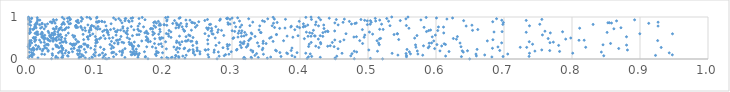
| Category | Series 0 |
|---|---|
| 0.6494886610343494 | 0.001 |
| 0.521462344505284 | 0.002 |
| 0.11608849450142009 | 0.003 |
| 0.27804752494028784 | 0.004 |
| 0.17644899707597306 | 0.005 |
| 0.47984781632911 | 0.006 |
| 0.4521540243167086 | 0.007 |
| 0.03461580034584222 | 0.008 |
| 0.3194482171691986 | 0.009 |
| 0.1137184963279405 | 0.01 |
| 0.09030818656221766 | 0.011 |
| 0.3169902203502368 | 0.012 |
| 0.4105012767373106 | 0.013 |
| 0.5036008177045362 | 0.014 |
| 0.31768928369719773 | 0.015 |
| 0.20602338840897308 | 0.016 |
| 0.11905451637764762 | 0.017 |
| 0.21639314690966088 | 0.018 |
| 0.3519166139028651 | 0.019 |
| 0.2308382323468313 | 0.02 |
| 0.45136389129884225 | 0.021 |
| 0.07502207136637869 | 0.022 |
| 0.3288669173679931 | 0.023 |
| 0.0843500697387894 | 0.024 |
| 0.11015393308047583 | 0.025 |
| 0.04388557988866332 | 0.026 |
| 0.014700348563221563 | 0.027 |
| 0.04069689261007055 | 0.028 |
| 0.09464828511411026 | 0.029 |
| 0.22182591513502103 | 0.03 |
| 0.19652974818995164 | 0.031 |
| 0.21071684444435138 | 0.032 |
| 0.05077171188107131 | 0.033 |
| 0.20404492660771553 | 0.034 |
| 0.0005223421724815143 | 0.035 |
| 0.142522578799775 | 0.036 |
| 0.33869406549150366 | 0.037 |
| 0.04964213489435691 | 0.038 |
| 0.31781598535940425 | 0.039 |
| 0.4298402847156558 | 0.04 |
| 0.16169248378899043 | 0.041 |
| 0.32810404902974544 | 0.042 |
| 0.21201989886324857 | 0.043 |
| 0.17243190627608285 | 0.044 |
| 0.2658015538731133 | 0.045 |
| 0.3568952925012712 | 0.046 |
| 0.3925011398297004 | 0.047 |
| 0.6821632982798048 | 0.048 |
| 0.09393251363926552 | 0.049 |
| 0.006020017742359295 | 0.05 |
| 0.4124164132873489 | 0.051 |
| 0.5565886241710607 | 0.052 |
| 0.1258697415392412 | 0.053 |
| 0.07612051388423166 | 0.054 |
| 0.07802081785905142 | 0.055 |
| 0.637436331963943 | 0.056 |
| 0.2216136582268961 | 0.057 |
| 0.17271470979084824 | 0.058 |
| 0.6985950466421643 | 0.059 |
| 0.3720980365507339 | 0.06 |
| 0.41718409904077886 | 0.061 |
| 0.73689545383707 | 0.062 |
| 0.041215482585070955 | 0.063 |
| 0.0021339338914680233 | 0.064 |
| 0.001865133544264478 | 0.065 |
| 0.4540390412171769 | 0.066 |
| 0.2811025030872496 | 0.067 |
| 0.05902101752125556 | 0.068 |
| 0.22767857338317726 | 0.069 |
| 0.6141444347383196 | 0.07 |
| 0.11156402404066898 | 0.071 |
| 0.08142129465043654 | 0.072 |
| 0.6593704401362447 | 0.073 |
| 0.09845212794665376 | 0.074 |
| 0.4747217766902059 | 0.075 |
| 0.21777567578590593 | 0.076 |
| 0.8467275410686786 | 0.077 |
| 0.058152115973771734 | 0.078 |
| 0.2885686934869976 | 0.079 |
| 0.388207333501798 | 0.08 |
| 0.18862834548246737 | 0.081 |
| 0.051446982025896 | 0.082 |
| 0.5565832977398479 | 0.083 |
| 0.21704594439855854 | 0.084 |
| 0.33367474930615787 | 0.085 |
| 0.9228195097448253 | 0.086 |
| 0.005740742731084875 | 0.087 |
| 0.10421251709805304 | 0.088 |
| 0.0361262454268739 | 0.089 |
| 0.2326286531945125 | 0.09 |
| 0.5804903267637865 | 0.091 |
| 0.16236943740363696 | 0.092 |
| 0.54401472925715 | 0.093 |
| 0.13798940811428392 | 0.094 |
| 0.004973049851910261 | 0.095 |
| 0.6716411342164854 | 0.096 |
| 0.0736699987943389 | 0.097 |
| 0.24539126062458969 | 0.098 |
| 0.9475536294726269 | 0.099 |
| 0.15197070107703603 | 0.1 |
| 0.10573655711410555 | 0.101 |
| 0.15704520524644855 | 0.102 |
| 0.2646988259223237 | 0.103 |
| 0.07923338026380734 | 0.104 |
| 0.29053812784480787 | 0.105 |
| 0.11395893438304763 | 0.106 |
| 0.008564612743335953 | 0.107 |
| 0.09669048238276043 | 0.108 |
| 0.024406453539530543 | 0.109 |
| 0.12971798132584947 | 0.11 |
| 0.1536043669407493 | 0.111 |
| 0.1874353585462693 | 0.112 |
| 0.34618051726109167 | 0.113 |
| 0.29554801496956556 | 0.114 |
| 0.15703902994418031 | 0.115 |
| 0.020249727889272144 | 0.116 |
| 0.6587956815969583 | 0.117 |
| 0.705515074166796 | 0.118 |
| 0.5733851764432616 | 0.119 |
| 0.2528935011124422 | 0.12 |
| 0.4150698207193128 | 0.121 |
| 0.5624674569833095 | 0.122 |
| 0.07290264576220701 | 0.123 |
| 0.1600500241689326 | 0.124 |
| 0.15630985537072578 | 0.125 |
| 0.03563804777516389 | 0.126 |
| 0.4764823204436721 | 0.127 |
| 0.38172839247803575 | 0.128 |
| 0.3361831290863529 | 0.129 |
| 0.5559493702366946 | 0.13 |
| 0.07603327418525646 | 0.131 |
| 0.1637134296481883 | 0.132 |
| 0.007424931813448635 | 0.133 |
| 0.05030379841607353 | 0.134 |
| 0.535479275379183 | 0.135 |
| 0.46181572507755253 | 0.136 |
| 0.7374749645225641 | 0.137 |
| 0.40847802505395 | 0.138 |
| 0.8010495657398039 | 0.139 |
| 0.18913269820395467 | 0.14 |
| 0.054594178377062666 | 0.141 |
| 0.10957943193494203 | 0.142 |
| 0.2430766108713254 | 0.143 |
| 0.38042543852181715 | 0.144 |
| 0.12321515116095474 | 0.145 |
| 0.9430002613933721 | 0.146 |
| 0.1388857724103417 | 0.147 |
| 0.19792205568538027 | 0.148 |
| 0.044782040619314865 | 0.149 |
| 0.05998934123280795 | 0.15 |
| 0.39566554308588525 | 0.151 |
| 0.15419022321396747 | 0.152 |
| 0.3704136347443543 | 0.153 |
| 0.005278708271918827 | 0.154 |
| 0.1917369538777228 | 0.155 |
| 0.05977559885887576 | 0.156 |
| 0.12615730703051228 | 0.157 |
| 0.09916216589450556 | 0.158 |
| 0.12418934390480439 | 0.159 |
| 0.27354000552512364 | 0.16 |
| 0.08502543478047973 | 0.161 |
| 0.0019670118983497746 | 0.162 |
| 0.22046212903786325 | 0.163 |
| 0.6401367441600829 | 0.164 |
| 0.8431647136437311 | 0.165 |
| 0.2799066810420926 | 0.166 |
| 0.3304912044788769 | 0.167 |
| 0.4833456466239459 | 0.168 |
| 0.1592070846086886 | 0.169 |
| 0.15091946754637192 | 0.17 |
| 0.5608354572556035 | 0.171 |
| 0.2989105453598567 | 0.172 |
| 0.17126424721291278 | 0.173 |
| 0.06549217583132368 | 0.174 |
| 0.25274631760380534 | 0.175 |
| 0.1385313388377381 | 0.176 |
| 0.6191432865971171 | 0.177 |
| 0.24362272000989474 | 0.178 |
| 0.04922484640027347 | 0.179 |
| 0.781737293305003 | 0.18 |
| 0.13493337500051142 | 0.181 |
| 0.047327222321522415 | 0.182 |
| 0.18910979585686197 | 0.183 |
| 0.02954960418930423 | 0.184 |
| 0.4798049193426273 | 0.185 |
| 0.5139706774507805 | 0.186 |
| 0.15607620834521158 | 0.187 |
| 0.7454567832819398 | 0.188 |
| 0.23563096626020155 | 0.189 |
| 0.5725461231175325 | 0.19 |
| 0.33055484147526115 | 0.191 |
| 0.36532684050721176 | 0.192 |
| 0.6058299698277697 | 0.193 |
| 0.638550155755553 | 0.194 |
| 0.02117534596698284 | 0.195 |
| 0.6463108829816143 | 0.196 |
| 0.0760752698321636 | 0.197 |
| 0.24874700414598408 | 0.198 |
| 0.05581551262226918 | 0.199 |
| 0.7672476705895918 | 0.2 |
| 0.07483048492096744 | 0.201 |
| 0.38700685743427393 | 0.202 |
| 0.6937457256038927 | 0.203 |
| 0.008035219251176342 | 0.204 |
| 0.0726992611738711 | 0.205 |
| 0.13921329002970653 | 0.206 |
| 0.02975977845998959 | 0.207 |
| 0.36404204219202296 | 0.208 |
| 0.26127597969385047 | 0.209 |
| 0.2489947636013488 | 0.21 |
| 0.32779740464520957 | 0.211 |
| 0.3066767545021251 | 0.212 |
| 0.2739226330594687 | 0.213 |
| 0.881525566059282 | 0.214 |
| 0.501222706563029 | 0.215 |
| 0.755530889673655 | 0.216 |
| 0.23751999655398304 | 0.217 |
| 0.050963534229020994 | 0.218 |
| 0.2604629456344577 | 0.219 |
| 0.008934631141835878 | 0.22 |
| 0.34463719875459226 | 0.221 |
| 0.004728723983251518 | 0.222 |
| 0.24261849562746973 | 0.223 |
| 0.09795522903747834 | 0.224 |
| 0.2178038575976246 | 0.225 |
| 0.26514458880435704 | 0.226 |
| 0.11153591177601119 | 0.227 |
| 0.5574045810858721 | 0.228 |
| 0.6604327016796618 | 0.229 |
| 0.3074035868647762 | 0.23 |
| 0.08288533075371864 | 0.231 |
| 0.022279549344032156 | 0.232 |
| 0.11175561698419494 | 0.233 |
| 0.1592735384224998 | 0.234 |
| 0.012981144247003688 | 0.235 |
| 0.1541379076687254 | 0.236 |
| 0.013200576453335059 | 0.237 |
| 0.03656805825016583 | 0.238 |
| 0.01793436677466723 | 0.239 |
| 0.06374319914384922 | 0.24 |
| 0.20347751622134286 | 0.241 |
| 0.2938699572541828 | 0.242 |
| 0.2294391957187075 | 0.243 |
| 0.4559501641203152 | 0.244 |
| 0.008254871750606286 | 0.245 |
| 0.006894924634581304 | 0.246 |
| 0.14266558290235395 | 0.247 |
| 0.5980132676904659 | 0.248 |
| 0.12247667196111676 | 0.249 |
| 0.8686737282387381 | 0.25 |
| 0.22281853332474755 | 0.251 |
| 0.0018522200527067267 | 0.252 |
| 0.06773360197517886 | 0.253 |
| 0.05142435652042647 | 0.254 |
| 0.6830072973621627 | 0.255 |
| 0.027264473249232715 | 0.256 |
| 0.3454060857852406 | 0.257 |
| 0.0674399122419657 | 0.258 |
| 0.23045746947288262 | 0.259 |
| 0.09232629601727392 | 0.26 |
| 0.3881976361238699 | 0.261 |
| 0.18795579889412867 | 0.262 |
| 0.15429707119767622 | 0.263 |
| 0.024891370539324355 | 0.264 |
| 0.24860750994034 | 0.265 |
| 0.007706102520252281 | 0.266 |
| 0.588553949464931 | 0.267 |
| 0.04977120173314961 | 0.268 |
| 0.2867564846536537 | 0.269 |
| 0.21964435243893682 | 0.27 |
| 0.04558446060368635 | 0.271 |
| 0.31381060653932485 | 0.272 |
| 0.4276569933848232 | 0.273 |
| 0.12583065938106847 | 0.274 |
| 0.931143590801347 | 0.275 |
| 0.07516804513392124 | 0.276 |
| 0.7333863509922961 | 0.277 |
| 0.7239055027659428 | 0.278 |
| 0.8201483601524081 | 0.279 |
| 0.10657667361875209 | 0.28 |
| 0.5704048504690287 | 0.281 |
| 0.32114724388447663 | 0.282 |
| 0.04414717657974206 | 0.283 |
| 0.078123986174957 | 0.284 |
| 0.015416170376930676 | 0.285 |
| 0.21458079440814273 | 0.286 |
| 0.6911081969891233 | 0.287 |
| 0.08783749916853334 | 0.288 |
| 0.18290508595374982 | 0.289 |
| 0.17461138423944184 | 0.29 |
| 0.0758287986264313 | 0.291 |
| 0.6367719150189647 | 0.292 |
| 0.00022962512884371576 | 0.293 |
| 0.4501700503165307 | 0.294 |
| 0.041817485306633644 | 0.295 |
| 0.1972844925743655 | 0.296 |
| 0.41267798980432757 | 0.297 |
| 0.5900601236272432 | 0.298 |
| 0.15377568480159298 | 0.299 |
| 0.2933896586755658 | 0.3 |
| 0.07824466394101869 | 0.301 |
| 0.015266564743028984 | 0.302 |
| 0.15536386987250903 | 0.303 |
| 0.4407271840352406 | 0.304 |
| 0.33944198868645764 | 0.305 |
| 0.423183912952787 | 0.306 |
| 0.04924296071480655 | 0.307 |
| 0.1629263088403124 | 0.308 |
| 0.09904295267070028 | 0.309 |
| 0.6083288572359316 | 0.31 |
| 0.0490708695439377 | 0.311 |
| 0.024250365449459334 | 0.312 |
| 0.12329579377296748 | 0.313 |
| 0.5816009679701056 | 0.314 |
| 0.4444507613787219 | 0.315 |
| 0.32314318395277264 | 0.316 |
| 0.0027653251379720412 | 0.317 |
| 0.04290030884760656 | 0.318 |
| 0.1622755403828924 | 0.319 |
| 0.08671196388095076 | 0.32 |
| 0.08826259150858722 | 0.321 |
| 0.2424160925289884 | 0.322 |
| 0.06568844078373932 | 0.323 |
| 0.7803554341638497 | 0.324 |
| 0.276379290982732 | 0.325 |
| 0.3121349461843676 | 0.326 |
| 0.011405992095324531 | 0.327 |
| 0.15265230935159205 | 0.328 |
| 0.06860020142375563 | 0.329 |
| 0.1527038421428817 | 0.33 |
| 0.8802309453502217 | 0.331 |
| 0.0296806454817106 | 0.332 |
| 0.00252019334879272 | 0.333 |
| 0.040792106599989046 | 0.334 |
| 0.0010867512504336078 | 0.335 |
| 0.5699031407729226 | 0.336 |
| 0.2961684632853318 | 0.337 |
| 0.8456183021644349 | 0.338 |
| 0.06767956649653979 | 0.339 |
| 0.516630233343135 | 0.34 |
| 0.22376964466074825 | 0.341 |
| 0.0025024282833313416 | 0.342 |
| 0.6014033020299704 | 0.343 |
| 0.29303131613695543 | 0.344 |
| 0.12049570202351287 | 0.345 |
| 0.6139243353053871 | 0.346 |
| 0.026906678039696853 | 0.347 |
| 0.1494479431153668 | 0.348 |
| 0.19224761003320734 | 0.349 |
| 0.02920892223499318 | 0.35 |
| 0.06452551335190145 | 0.351 |
| 0.7420473268039514 | 0.352 |
| 0.08319541446260896 | 0.353 |
| 0.413570071380825 | 0.354 |
| 0.32350600040377664 | 0.355 |
| 0.08189947504324353 | 0.356 |
| 0.08397219774653672 | 0.357 |
| 0.13238698723763687 | 0.358 |
| 0.2645480376294325 | 0.359 |
| 0.06755703321511021 | 0.36 |
| 0.430556659908537 | 0.361 |
| 0.6120003238980708 | 0.362 |
| 0.19572370437407155 | 0.363 |
| 0.062294502039626845 | 0.364 |
| 0.07075939410547107 | 0.365 |
| 0.31716687519725956 | 0.366 |
| 0.18602265127874543 | 0.367 |
| 0.3501648076986368 | 0.368 |
| 0.492078854532376 | 0.369 |
| 0.8567314498293633 | 0.37 |
| 0.0018489994356193171 | 0.371 |
| 0.3456718393208354 | 0.372 |
| 0.3151054722855979 | 0.373 |
| 0.15187038226249638 | 0.374 |
| 0.24817733301616013 | 0.375 |
| 0.5899319164831457 | 0.376 |
| 0.1270681743313695 | 0.377 |
| 0.04711196553172926 | 0.378 |
| 0.5156072618495326 | 0.379 |
| 0.6353604654067103 | 0.38 |
| 0.0996691305462469 | 0.381 |
| 0.5934785100103356 | 0.382 |
| 0.005389339360726266 | 0.383 |
| 0.696546189564966 | 0.384 |
| 0.3374714256783928 | 0.385 |
| 0.14077805435166832 | 0.386 |
| 0.2811217216523442 | 0.387 |
| 0.13260519171730814 | 0.388 |
| 0.7675948223297351 | 0.389 |
| 0.2221324682213878 | 0.39 |
| 0.2184389762660697 | 0.391 |
| 0.43016451612611306 | 0.392 |
| 0.056100795810402525 | 0.393 |
| 0.4475124251924372 | 0.394 |
| 0.4164886319861704 | 0.395 |
| 0.01902782239207472 | 0.396 |
| 0.023978969684938088 | 0.397 |
| 0.14864897572363472 | 0.398 |
| 0.1019648312781426 | 0.399 |
| 0.1382259922670169 | 0.4 |
| 0.7725970237648438 | 0.401 |
| 0.3123554537996094 | 0.402 |
| 0.15638793365503698 | 0.403 |
| 0.05181613809863071 | 0.404 |
| 0.049982431621588407 | 0.405 |
| 0.0027499509196110003 | 0.406 |
| 0.07442456374089641 | 0.407 |
| 0.24795844518719384 | 0.408 |
| 0.1768176826924171 | 0.409 |
| 0.20237968688850216 | 0.41 |
| 0.7371763172020294 | 0.411 |
| 0.22645475195082898 | 0.412 |
| 0.07284863080592288 | 0.413 |
| 0.3178822911243311 | 0.414 |
| 0.4590286485962853 | 0.415 |
| 0.1799004961048239 | 0.416 |
| 0.009956819111958944 | 0.417 |
| 0.10093081336668562 | 0.418 |
| 0.36043244254446993 | 0.419 |
| 0.12271146635183013 | 0.42 |
| 0.2393839836992516 | 0.421 |
| 0.03684560627115418 | 0.422 |
| 0.34593123752864496 | 0.423 |
| 0.2411233722782306 | 0.424 |
| 0.2336008579051462 | 0.425 |
| 0.05493750497659844 | 0.426 |
| 0.2315296767591623 | 0.427 |
| 0.2186707714547313 | 0.428 |
| 0.16729440056436684 | 0.429 |
| 0.596739229081641 | 0.43 |
| 0.6754879463762418 | 0.431 |
| 0.03274493489430577 | 0.432 |
| 0.002441634310334094 | 0.433 |
| 0.03145840913811805 | 0.434 |
| 0.3758452392051174 | 0.435 |
| 0.5133195771100996 | 0.436 |
| 0.48782899813069763 | 0.437 |
| 0.9259673294644298 | 0.438 |
| 0.041914699500340054 | 0.439 |
| 0.32452562034715543 | 0.44 |
| 0.00464334649536796 | 0.441 |
| 0.036904247008727034 | 0.442 |
| 0.130041832360717 | 0.443 |
| 0.010558166956415399 | 0.444 |
| 0.1739129047252974 | 0.445 |
| 0.8102891829881339 | 0.446 |
| 0.8179137395667074 | 0.447 |
| 0.09966656357164166 | 0.448 |
| 0.01700641289367919 | 0.449 |
| 0.13205614485827363 | 0.45 |
| 0.23561903042263355 | 0.451 |
| 0.10092564867409921 | 0.452 |
| 0.4512295242538652 | 0.453 |
| 0.2642134273972013 | 0.454 |
| 0.4646014003826519 | 0.455 |
| 0.029199130257999917 | 0.456 |
| 0.0485435755326582 | 0.457 |
| 0.176342652789152 | 0.458 |
| 0.6836864543889479 | 0.459 |
| 0.01146028895175301 | 0.46 |
| 0.029640302655218664 | 0.461 |
| 0.08186482392795308 | 0.462 |
| 0.5451432369517811 | 0.463 |
| 0.07030988850031045 | 0.464 |
| 0.023776071342763418 | 0.465 |
| 0.04553640785968618 | 0.466 |
| 0.1350782360405746 | 0.467 |
| 0.10087275669763782 | 0.468 |
| 0.037793420976999795 | 0.469 |
| 0.6299942295443666 | 0.47 |
| 0.19442692789947325 | 0.471 |
| 0.08858490482585864 | 0.472 |
| 0.790725360054781 | 0.473 |
| 0.42694900496710037 | 0.474 |
| 0.040148983893129805 | 0.475 |
| 0.14933705032485692 | 0.476 |
| 0.326593092644899 | 0.477 |
| 0.009767623246026801 | 0.478 |
| 0.10502450224054864 | 0.479 |
| 0.5168880977488125 | 0.48 |
| 0.028891181322808237 | 0.481 |
| 0.0405318799763361 | 0.482 |
| 0.18654760484583027 | 0.483 |
| 0.40643249517722846 | 0.484 |
| 0.05451021526835324 | 0.485 |
| 0.1135287931919236 | 0.486 |
| 0.7649329035442461 | 0.487 |
| 0.6255261621876759 | 0.488 |
| 0.30141107079239615 | 0.489 |
| 0.5185429340142386 | 0.49 |
| 0.17574044901659608 | 0.491 |
| 0.02391110527426982 | 0.492 |
| 0.32768898162319193 | 0.493 |
| 0.11964343579305012 | 0.494 |
| 0.03458509083337352 | 0.495 |
| 0.35531709768236863 | 0.496 |
| 0.5686307203553027 | 0.497 |
| 0.025517001227192703 | 0.498 |
| 0.03719898995064854 | 0.499 |
| 0.7982190996544581 | 0.5 |
| 0.19837990765247634 | 0.501 |
| 0.2753032676562534 | 0.502 |
| 0.1935858331727575 | 0.503 |
| 0.007691684366191837 | 0.504 |
| 0.10701461332684958 | 0.505 |
| 0.3025493387132806 | 0.506 |
| 0.196189759351072 | 0.507 |
| 0.12465390686528474 | 0.508 |
| 0.14601294509964746 | 0.509 |
| 0.021551430032871036 | 0.51 |
| 0.24270917718842844 | 0.511 |
| 0.008634524561328924 | 0.512 |
| 0.04913853205087169 | 0.513 |
| 0.2102876976739067 | 0.514 |
| 0.04243379783143866 | 0.515 |
| 0.011143165829274954 | 0.516 |
| 0.06750237889849203 | 0.517 |
| 0.49431001201115166 | 0.518 |
| 0.3895239508523013 | 0.519 |
| 0.3577839356211021 | 0.52 |
| 0.04961163055227645 | 0.521 |
| 0.3088011072030307 | 0.522 |
| 0.4792680348367181 | 0.523 |
| 0.020270562421919918 | 0.524 |
| 0.08722474432782158 | 0.525 |
| 0.08784986533472594 | 0.526 |
| 0.5944532000044007 | 0.527 |
| 0.1738578109629669 | 0.528 |
| 0.8801318041038515 | 0.529 |
| 0.48300743192055823 | 0.53 |
| 0.032383148597700175 | 0.531 |
| 0.23246339939075975 | 0.532 |
| 0.022388342547470484 | 0.533 |
| 0.6314807726031683 | 0.534 |
| 0.09900561880755304 | 0.535 |
| 0.13682248306823971 | 0.536 |
| 0.33390329818246034 | 0.537 |
| 0.04539967903076098 | 0.538 |
| 0.4335561348824873 | 0.539 |
| 0.31394150388798614 | 0.54 |
| 0.41181417818588817 | 0.541 |
| 0.41618483686390395 | 0.542 |
| 0.20693032621536855 | 0.543 |
| 0.22280059573107241 | 0.544 |
| 0.3810347541057559 | 0.545 |
| 0.06869627178938441 | 0.546 |
| 0.42230316650639294 | 0.547 |
| 0.3176846656421668 | 0.548 |
| 0.26576489460377295 | 0.549 |
| 0.03317913781157536 | 0.55 |
| 0.42136841665228697 | 0.551 |
| 0.2384057122126267 | 0.552 |
| 0.09094917712103358 | 0.553 |
| 0.39713674813892585 | 0.554 |
| 0.4296988601090709 | 0.555 |
| 0.15364554646792766 | 0.556 |
| 0.11118856466590048 | 0.557 |
| 0.5720062106674094 | 0.558 |
| 0.031791628575792596 | 0.559 |
| 0.0457926818807065 | 0.56 |
| 0.2879421871790201 | 0.561 |
| 0.05599624415127045 | 0.562 |
| 0.06572082526323653 | 0.563 |
| 0.02462502548370041 | 0.564 |
| 0.03725991857889591 | 0.565 |
| 0.021325609158823887 | 0.566 |
| 0.09153995736061034 | 0.567 |
| 0.12957783353250688 | 0.568 |
| 0.5990670384634829 | 0.569 |
| 0.4953507386346458 | 0.57 |
| 0.034198622693978144 | 0.571 |
| 0.2363013006786413 | 0.572 |
| 0.7565038207810274 | 0.573 |
| 0.045376192206765975 | 0.574 |
| 0.18357681911819182 | 0.575 |
| 0.11842702262133303 | 0.576 |
| 0.32102083571170853 | 0.577 |
| 0.16025016614498125 | 0.578 |
| 0.04474177436992991 | 0.579 |
| 0.1633457875666798 | 0.58 |
| 0.36537942582573585 | 0.581 |
| 0.5383103609060452 | 0.582 |
| 0.36543615457210604 | 0.583 |
| 0.014602903103476854 | 0.584 |
| 0.04776697279044935 | 0.585 |
| 0.012907217437541195 | 0.586 |
| 0.08102106583878568 | 0.587 |
| 0.039819382582909596 | 0.588 |
| 0.1462013093788652 | 0.589 |
| 0.19223795409447814 | 0.59 |
| 0.013839672255903532 | 0.591 |
| 0.5068021092274299 | 0.592 |
| 0.27229158153530775 | 0.593 |
| 0.018838155525088225 | 0.594 |
| 0.329357904349798 | 0.595 |
| 0.20627449419970623 | 0.596 |
| 0.09534687518836509 | 0.597 |
| 0.5434163434685133 | 0.598 |
| 0.9477893519934739 | 0.599 |
| 0.2708689976098817 | 0.6 |
| 0.8997217146669126 | 0.601 |
| 0.46764403750103956 | 0.602 |
| 0.5429768041673403 | 0.603 |
| 0.2602676050152908 | 0.604 |
| 0.17642329555659284 | 0.605 |
| 0.203460166891126 | 0.606 |
| 0.00213186862413745 | 0.607 |
| 0.18584094599933082 | 0.608 |
| 0.03789574781778637 | 0.609 |
| 0.01030118432044046 | 0.61 |
| 0.4179492121513571 | 0.611 |
| 0.30926035007319225 | 0.612 |
| 0.03533277778428894 | 0.613 |
| 0.021121062146633528 | 0.614 |
| 0.002023708761768616 | 0.615 |
| 0.17491357951879716 | 0.616 |
| 0.059295504345420004 | 0.617 |
| 0.31361267790492087 | 0.618 |
| 0.32821523352115967 | 0.619 |
| 0.6114003710118284 | 0.62 |
| 0.7681416511045157 | 0.621 |
| 0.144136790217277 | 0.622 |
| 0.030508251232348658 | 0.623 |
| 0.1718177648520078 | 0.624 |
| 0.41422406854242805 | 0.625 |
| 0.1442112744388044 | 0.626 |
| 0.43368269036627666 | 0.627 |
| 0.3427745137760646 | 0.628 |
| 0.11762777213785958 | 0.629 |
| 0.1167031933002607 | 0.63 |
| 0.3419040265236461 | 0.631 |
| 0.003562655595303301 | 0.632 |
| 0.8516399744312555 | 0.633 |
| 0.31873507966435416 | 0.634 |
| 0.27882939719401345 | 0.635 |
| 0.7326745610309039 | 0.636 |
| 0.020510211415821777 | 0.637 |
| 0.09006752066656581 | 0.638 |
| 0.40937002469412037 | 0.639 |
| 0.012570662994124628 | 0.64 |
| 0.5020908928068587 | 0.641 |
| 0.04382319893465539 | 0.642 |
| 0.68532095609284 | 0.643 |
| 0.013975907294014754 | 0.644 |
| 0.1302931132613048 | 0.645 |
| 0.2101282129236242 | 0.646 |
| 0.18353668742997098 | 0.647 |
| 0.7861507993096627 | 0.648 |
| 0.4372734140963919 | 0.649 |
| 0.19445206297675946 | 0.65 |
| 0.6971863570495469 | 0.651 |
| 0.4412047256184647 | 0.652 |
| 0.586037226952881 | 0.653 |
| 0.039396841847792935 | 0.654 |
| 0.1097361633057646 | 0.655 |
| 0.1286547472706811 | 0.656 |
| 0.3040102236339131 | 0.657 |
| 0.165692817165306 | 0.658 |
| 0.26935837934750584 | 0.659 |
| 0.029692822856690695 | 0.66 |
| 0.17418269769202685 | 0.661 |
| 0.7602089974733992 | 0.662 |
| 0.22982740240357316 | 0.663 |
| 0.4403373859352701 | 0.664 |
| 0.1169838036482961 | 0.665 |
| 0.14092886790318718 | 0.666 |
| 0.31049243312030467 | 0.667 |
| 0.45101528829625787 | 0.668 |
| 0.002869975789215161 | 0.669 |
| 0.230376343878849 | 0.67 |
| 0.16312536674316364 | 0.671 |
| 0.314540207431458 | 0.672 |
| 0.3002219801081016 | 0.673 |
| 0.14596051229884816 | 0.674 |
| 0.08451925499715927 | 0.675 |
| 0.5892274272490424 | 0.676 |
| 0.6025870735632782 | 0.677 |
| 0.09009455748456119 | 0.678 |
| 0.2074025908226936 | 0.679 |
| 0.2703539083095851 | 0.68 |
| 0.2845630895054759 | 0.681 |
| 0.6537189539363154 | 0.682 |
| 0.41973991406365496 | 0.683 |
| 0.11239494673030176 | 0.684 |
| 0.24028949324085935 | 0.685 |
| 0.1318410071293692 | 0.686 |
| 0.13607316415004225 | 0.687 |
| 0.05062757384739839 | 0.688 |
| 0.5920532124366479 | 0.689 |
| 0.04522396293055649 | 0.69 |
| 0.09263270120080523 | 0.691 |
| 0.33982959097723414 | 0.692 |
| 0.11558255302823724 | 0.693 |
| 0.15581488960384024 | 0.694 |
| 0.2798723582775121 | 0.695 |
| 0.08027237939651727 | 0.696 |
| 0.39238070659545765 | 0.697 |
| 0.0537101737062803 | 0.698 |
| 0.12135372370864138 | 0.699 |
| 0.49173818781007206 | 0.7 |
| 0.6614837382720329 | 0.701 |
| 0.26444785358395734 | 0.702 |
| 0.007327849938260736 | 0.703 |
| 0.5222810592086351 | 0.704 |
| 0.22830406785416588 | 0.705 |
| 0.19376893997844427 | 0.706 |
| 0.5171260076267069 | 0.707 |
| 0.16148785944970936 | 0.708 |
| 0.10231789548855684 | 0.709 |
| 0.03860164381324947 | 0.71 |
| 0.0030545858180077 | 0.711 |
| 0.05478307790535091 | 0.712 |
| 0.04707321342246616 | 0.713 |
| 0.09225600828538774 | 0.714 |
| 0.10574854633318262 | 0.715 |
| 0.18027551659939123 | 0.716 |
| 0.00859296202329838 | 0.717 |
| 0.023833539661040837 | 0.718 |
| 0.8615863930408437 | 0.719 |
| 0.18347022947815267 | 0.72 |
| 0.0032827934957824 | 0.721 |
| 0.12634505251918116 | 0.722 |
| 0.037162018121791075 | 0.723 |
| 0.008995905764305008 | 0.724 |
| 0.43528823827343255 | 0.725 |
| 0.04631583839049078 | 0.726 |
| 0.04142803141616524 | 0.727 |
| 0.1809014983322376 | 0.728 |
| 0.3700937234215688 | 0.729 |
| 0.14646003986119763 | 0.73 |
| 0.26990188203535365 | 0.731 |
| 0.5602029029417815 | 0.732 |
| 0.8112660733046301 | 0.733 |
| 0.01848171686716565 | 0.734 |
| 0.1393300497452754 | 0.735 |
| 0.09956374191218818 | 0.736 |
| 0.3779165814291789 | 0.737 |
| 0.2654434111630726 | 0.738 |
| 0.2174773221369885 | 0.739 |
| 0.2627210859117665 | 0.74 |
| 0.08358551943152308 | 0.741 |
| 0.011964885001673748 | 0.742 |
| 0.09171662921396534 | 0.743 |
| 0.8719597755444305 | 0.744 |
| 0.0566031456557797 | 0.745 |
| 0.39940629058052385 | 0.746 |
| 0.07832081494002543 | 0.747 |
| 0.2214842145488057 | 0.748 |
| 0.04857482279637142 | 0.749 |
| 0.36264912240820485 | 0.75 |
| 0.05958482323221792 | 0.751 |
| 0.07054716671008499 | 0.752 |
| 0.07314395760214347 | 0.753 |
| 0.5824400961579141 | 0.754 |
| 0.0711447730617127 | 0.755 |
| 0.18770545307959371 | 0.756 |
| 0.24618309277909065 | 0.757 |
| 0.02048546484543894 | 0.758 |
| 0.3119533647856948 | 0.759 |
| 0.6110434863911006 | 0.76 |
| 0.3865353978866971 | 0.761 |
| 0.6035936255071747 | 0.762 |
| 0.404755995285841 | 0.763 |
| 0.009871850706292531 | 0.764 |
| 0.1699274328945229 | 0.765 |
| 0.305491300400988 | 0.766 |
| 0.22669284321448013 | 0.767 |
| 0.04176023529961485 | 0.768 |
| 0.13959921031206057 | 0.769 |
| 0.2762106841322016 | 0.77 |
| 0.3959927031581398 | 0.771 |
| 0.1029705370946271 | 0.772 |
| 0.15193231555130765 | 0.773 |
| 0.02618612789686211 | 0.774 |
| 0.07764982970162713 | 0.775 |
| 0.4056068726663974 | 0.776 |
| 0.09670774256262094 | 0.777 |
| 0.4079449653787278 | 0.778 |
| 0.23300932002324434 | 0.779 |
| 0.3872447930068639 | 0.78 |
| 0.06995614340043987 | 0.781 |
| 0.09314743036494333 | 0.782 |
| 0.16183977624642817 | 0.783 |
| 0.9265747766225445 | 0.784 |
| 0.6443489148454168 | 0.785 |
| 0.011124291966687577 | 0.786 |
| 0.11479081753440472 | 0.787 |
| 0.3408060804492111 | 0.788 |
| 0.42723163771223266 | 0.789 |
| 0.7374814012432925 | 0.79 |
| 0.35906765953222347 | 0.791 |
| 0.1854348666702498 | 0.792 |
| 0.5323358587779543 | 0.793 |
| 0.3262951152283569 | 0.794 |
| 0.22241196142941824 | 0.795 |
| 0.07018335728294009 | 0.796 |
| 0.5564142826141071 | 0.797 |
| 0.09380265867821158 | 0.798 |
| 0.24860679596318377 | 0.799 |
| 0.07068329682907264 | 0.8 |
| 0.00375107019453926 | 0.801 |
| 0.19282659010500752 | 0.802 |
| 0.20419865320423475 | 0.803 |
| 0.22193734866605283 | 0.804 |
| 0.6528471906419634 | 0.805 |
| 0.19494974246781688 | 0.806 |
| 0.3142414858892176 | 0.807 |
| 0.41143772977329474 | 0.808 |
| 0.4349315940902419 | 0.809 |
| 0.21890376970807063 | 0.81 |
| 0.08812409752919857 | 0.811 |
| 0.45610002174759035 | 0.812 |
| 0.010113004719378366 | 0.813 |
| 0.017043080690718006 | 0.814 |
| 0.20008355939929595 | 0.815 |
| 0.20032266645119623 | 0.816 |
| 0.4227673972389991 | 0.817 |
| 0.02485059387129459 | 0.818 |
| 0.49906491019828264 | 0.819 |
| 0.2199984356082422 | 0.82 |
| 0.26696397070805433 | 0.821 |
| 0.04971955256796957 | 0.822 |
| 0.8310265657929652 | 0.823 |
| 0.6983433073043601 | 0.824 |
| 0.29446866684907175 | 0.825 |
| 0.2686018087113588 | 0.826 |
| 0.7526431840202956 | 0.827 |
| 0.5032676624354312 | 0.828 |
| 0.5199749669581978 | 0.829 |
| 0.05357076866463434 | 0.83 |
| 0.0008480253757334483 | 0.831 |
| 0.29727408649425546 | 0.832 |
| 0.47575053691553515 | 0.833 |
| 0.23340280748228662 | 0.834 |
| 0.02045796482616508 | 0.835 |
| 0.0287317559214649 | 0.836 |
| 0.06040949287440769 | 0.837 |
| 0.40499349042297683 | 0.838 |
| 0.12220641427245196 | 0.839 |
| 0.013398132555102395 | 0.84 |
| 0.16393584656203894 | 0.841 |
| 0.05081209529803333 | 0.842 |
| 0.1939437074176888 | 0.843 |
| 0.06251387198604517 | 0.844 |
| 0.48081015974389874 | 0.845 |
| 0.21291066889559826 | 0.846 |
| 0.011746225596537162 | 0.847 |
| 0.2248011978944942 | 0.848 |
| 0.9128566107544017 | 0.849 |
| 0.02077157595518074 | 0.85 |
| 0.24516147695913734 | 0.851 |
| 0.36103743338256455 | 0.852 |
| 0.03982140979389092 | 0.853 |
| 0.18891931939933795 | 0.854 |
| 0.21826692447833557 | 0.855 |
| 0.8580485138784961 | 0.856 |
| 0.4827940679830291 | 0.857 |
| 0.035273259371063646 | 0.858 |
| 0.45125089297031323 | 0.859 |
| 0.30328528905992747 | 0.86 |
| 0.1382113202232104 | 0.861 |
| 0.8528024013095369 | 0.862 |
| 0.2940448642645033 | 0.863 |
| 0.8548413439607421 | 0.864 |
| 0.0745946315258411 | 0.865 |
| 0.24230477884888474 | 0.866 |
| 0.184867407765915 | 0.867 |
| 0.6990904847194542 | 0.868 |
| 0.3664016343543089 | 0.869 |
| 0.24076227623849747 | 0.87 |
| 0.05210586601083843 | 0.871 |
| 0.10251543656630668 | 0.872 |
| 0.46333737348472376 | 0.873 |
| 0.07264279702999528 | 0.874 |
| 0.5047266204205555 | 0.875 |
| 0.9266081886865123 | 0.876 |
| 0.013078508176120567 | 0.877 |
| 0.33050982864105877 | 0.878 |
| 0.0032234067473401445 | 0.879 |
| 0.11263331306182854 | 0.88 |
| 0.4236445027518253 | 0.881 |
| 0.10068491939390169 | 0.882 |
| 0.0352384638547081 | 0.883 |
| 0.03270731567581879 | 0.884 |
| 0.14891567038419223 | 0.885 |
| 0.2511391640801312 | 0.886 |
| 0.6834241886681 | 0.887 |
| 0.18674333408931557 | 0.888 |
| 0.05849802426082192 | 0.889 |
| 0.003986520968845538 | 0.89 |
| 0.34780927264433853 | 0.891 |
| 0.10473687971246279 | 0.892 |
| 0.10881563397129462 | 0.893 |
| 0.10348301535579327 | 0.894 |
| 0.4726089865509554 | 0.895 |
| 0.1916889274911588 | 0.896 |
| 0.3988646198300198 | 0.897 |
| 0.03823403850855587 | 0.898 |
| 0.10847759111877861 | 0.899 |
| 0.5302728403273065 | 0.9 |
| 0.07840759264686657 | 0.901 |
| 0.0710237474240572 | 0.902 |
| 0.31108793276115965 | 0.903 |
| 0.511263137255381 | 0.904 |
| 0.15320760067093772 | 0.905 |
| 0.20410208745402564 | 0.906 |
| 0.8655204855411378 | 0.907 |
| 0.49890257859162335 | 0.908 |
| 0.14262836297896883 | 0.909 |
| 0.14792018518313108 | 0.91 |
| 0.3448522082150809 | 0.911 |
| 0.5035537999507207 | 0.912 |
| 0.640651245924646 | 0.913 |
| 0.5474873474396119 | 0.914 |
| 0.2155653776329443 | 0.915 |
| 0.26004984035777895 | 0.916 |
| 0.014282506372331201 | 0.917 |
| 0.13611919839440054 | 0.918 |
| 0.7326665951135336 | 0.919 |
| 0.2819222067729979 | 0.92 |
| 0.4951138613857386 | 0.921 |
| 0.07332130282214562 | 0.922 |
| 0.6967527956890696 | 0.923 |
| 0.23821281950469023 | 0.924 |
| 0.017436365482577425 | 0.925 |
| 0.5172178739290553 | 0.926 |
| 0.23221356051314418 | 0.927 |
| 0.0615072021596872 | 0.928 |
| 0.001326233960307493 | 0.929 |
| 0.5778162637399374 | 0.93 |
| 0.20454673769899154 | 0.931 |
| 0.8920598335841038 | 0.932 |
| 0.04181425354268273 | 0.933 |
| 0.4302640720227154 | 0.934 |
| 0.17205434219499682 | 0.935 |
| 0.03729523920663536 | 0.936 |
| 0.014300180223763104 | 0.937 |
| 0.12893004585604542 | 0.938 |
| 0.4534196704828127 | 0.939 |
| 0.4895998935538498 | 0.94 |
| 0.26396937069806664 | 0.941 |
| 0.41683836557926185 | 0.942 |
| 0.7556850383537143 | 0.943 |
| 0.29708029804134717 | 0.944 |
| 0.37862009406816594 | 0.945 |
| 0.062487077352992325 | 0.946 |
| 0.0007942148505459387 | 0.947 |
| 0.28292348538689455 | 0.948 |
| 0.4652164239769586 | 0.949 |
| 0.3623235290882846 | 0.95 |
| 0.616048298328327 | 0.951 |
| 0.053146152706662855 | 0.952 |
| 0.08010443090179636 | 0.953 |
| 0.09228319335696232 | 0.954 |
| 0.5557459850896574 | 0.955 |
| 0.35256493103998 | 0.956 |
| 0.2927966683486612 | 0.957 |
| 0.32450458696171836 | 0.958 |
| 0.6891021437600581 | 0.959 |
| 0.1428605749932946 | 0.96 |
| 0.005036208363317374 | 0.961 |
| 0.13358686248856483 | 0.962 |
| 0.1632448962534974 | 0.963 |
| 0.5275609734458055 | 0.964 |
| 0.14382496944323664 | 0.965 |
| 0.29210421257828767 | 0.966 |
| 0.5107113186093368 | 0.967 |
| 0.22227804977310908 | 0.968 |
| 0.058121768935272725 | 0.969 |
| 0.1515158569881427 | 0.97 |
| 0.44305896681311235 | 0.971 |
| 0.005508086361541334 | 0.972 |
| 0.0008140533398621309 | 0.973 |
| 0.29357152343440424 | 0.974 |
| 0.3001943252419006 | 0.975 |
| 0.6243811150870454 | 0.976 |
| 0.6007097670553712 | 0.977 |
| 0.10095663695102555 | 0.978 |
| 0.12585491285723127 | 0.979 |
| 0.30831443085912763 | 0.98 |
| 0.15401211917346805 | 0.981 |
| 0.013626009412280492 | 0.982 |
| 0.4276197967640455 | 0.983 |
| 0.22367199258411066 | 0.984 |
| 0.09053892365117137 | 0.985 |
| 0.2024677425150628 | 0.986 |
| 0.06063436838260206 | 0.987 |
| 0.07839284071256507 | 0.988 |
| 0.5855632514370371 | 0.989 |
| 0.16797827677640612 | 0.99 |
| 0.0504777924130256 | 0.991 |
| 0.4086384124169426 | 0.992 |
| 0.36049725507532737 | 0.993 |
| 0.08666850729732413 | 0.994 |
| 0.0006759705430620892 | 0.995 |
| 0.1015298011306067 | 0.996 |
| 0.20580107497599592 | 0.997 |
| 0.41626072467656006 | 0.998 |
| 0.5587977791060582 | 0.999 |
| 0.5348985154909653 | 1 |